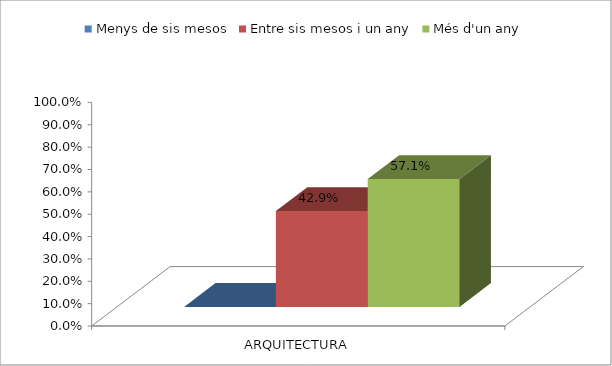
| Category | Menys de sis mesos | Entre sis mesos i un any | Més d'un any |
|---|---|---|---|
| ARQUITECTURA | 0 | 0.429 | 0.571 |